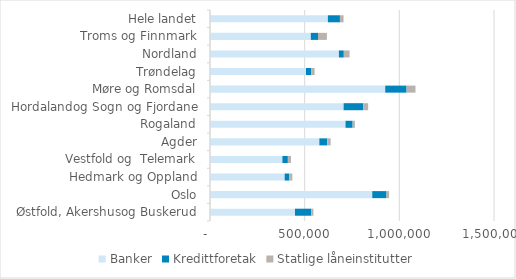
| Category | Banker | Kredittforetak | Statlige låneinstitutter |
|---|---|---|---|
| Østfold, Akershusog Buskerud | 448884.111 | 85591.679 | 11661.259 |
| Oslo | 856944.223 | 75319.86 | 13538.327 |
| Hedmark og Oppland | 394393.73 | 24269.249 | 16210.235 |
| Vestfold og  Telemark | 382320.096 | 28975.821 | 16429.502 |
| Agder | 577448.37 | 41452.85 | 18309.199 |
| Rogaland | 715742.908 | 37544.971 | 11936.332 |
| Hordalandog Sogn og Fjordane | 705646.35 | 103476.945 | 26155.638 |
| Møre og Romsdal | 925402.59 | 112795.301 | 47166.396 |
| Trøndelag | 506816.398 | 28429.199 | 17364.602 |
| Nordland | 680730.007 | 25985.25 | 30378.543 |
| Troms og Finnmark | 532501.928 | 38038.97 | 46959.356 |
| Hele landet | 622647.238 | 63682.017 | 19030.981 |